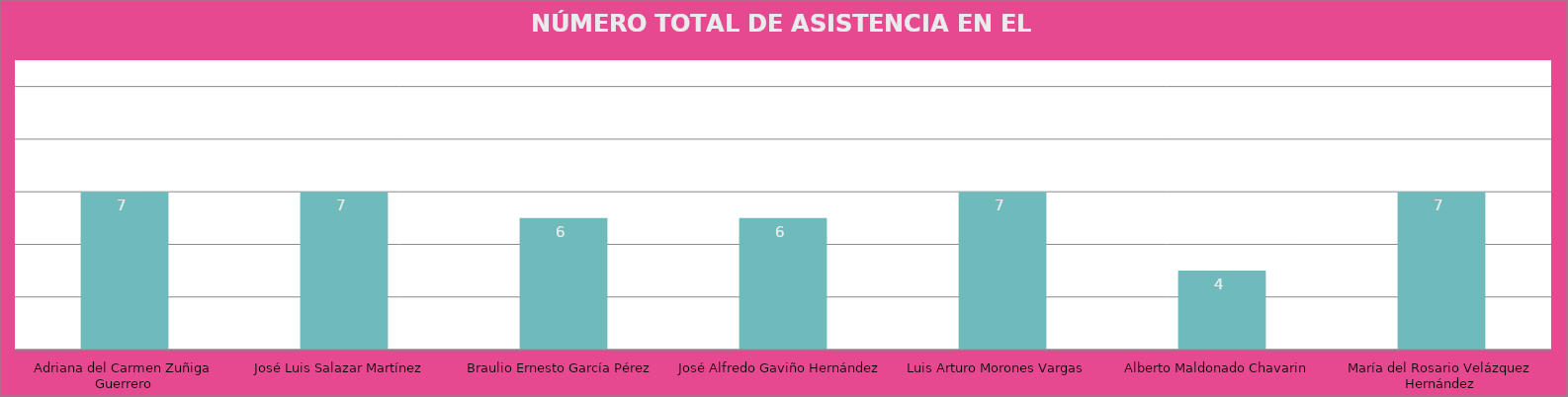
| Category | Adriana del Carmen Zuñiga Guerrero José Luis Salazar Martínez  Braulio Ernesto García Pérez José Alfredo Gaviño Hernández Luis Arturo Morones Vargas  Alberto Maldonado Chavarin  María del Rosario Velázquez Hernández |
|---|---|
| Adriana del Carmen Zuñiga Guerrero | 7 |
| José Luis Salazar Martínez  | 7 |
| Braulio Ernesto García Pérez | 6 |
| José Alfredo Gaviño Hernández | 6 |
| Luis Arturo Morones Vargas  | 7 |
| Alberto Maldonado Chavarin  | 4 |
| María del Rosario Velázquez Hernández | 7 |